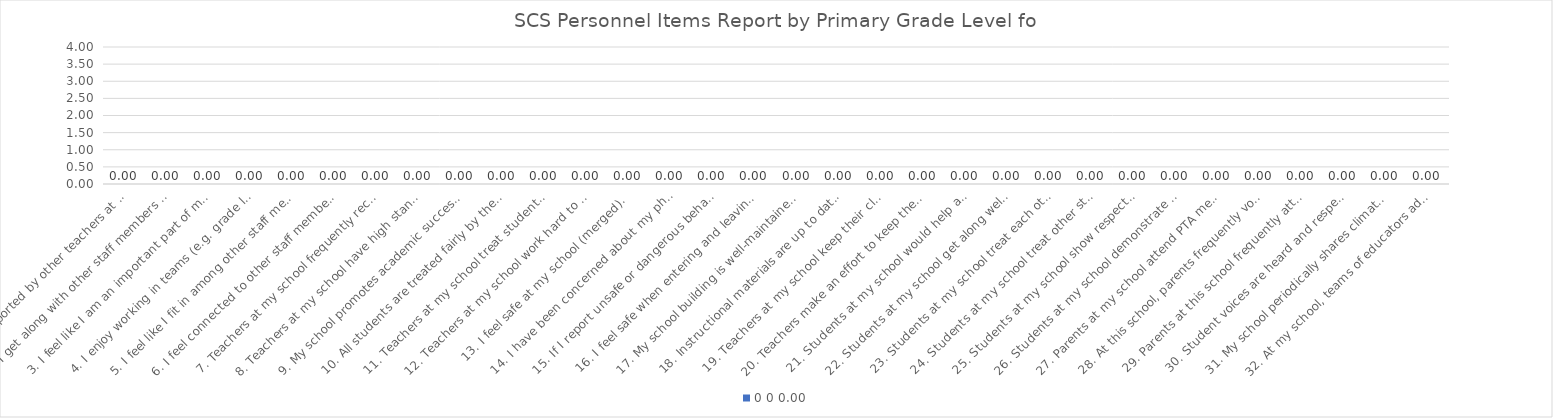
| Category | 0 |
|---|---|
| 1. I feel supported by other teachers at my school (merged) | 0 |
| 2. I get along with other staff members at my school (merged). | 0 |
| 3. I feel like I am an important part of my school (merged). | 0 |
| 4. I enjoy working in teams (e.g. grade level, content) at my school (merged). | 0 |
| 5. I feel like I fit in among other staff members at my school (merged). | 0 |
| 6. I feel connected to other staff members at my school (merged). | 0 |
| 7. Teachers at my school frequently recognize students for good behavior (merged). | 0 |
| 8. Teachers at my school have high standards for achievement (merged). | 0 |
| 9. My school promotes academic success for all students (merged). | 0 |
| 10. All students are treated fairly by the adults at my school (merged). | 0 |
| 11. Teachers at my school treat students fairly regardless of race, ethnicity, or culture (merged). | 0 |
| 12. Teachers at my school work hard to make sure that students do well (merged). | 0 |
| 13. I feel safe at my school (merged). | 0 |
| 14. I have been concerned about my physical safety at school (merged). | 0 |
| 15. If I report unsafe or dangerous behaviors, I can be sure the problem will be taken care of (merged). | 0 |
| 16. I feel safe when entering and leaving my school building (merged). | 0 |
| 17. My school building is well-maintained (merged). | 0 |
| 18. Instructional materials are up to date and in good condition (merged). | 0 |
| 19. Teachers at my school keep their classrooms clean and organized (merged). | 0 |
| 20. Teachers make an effort to keep the school building and facilities clean (merged). | 0 |
| 21. Students at my school would help another student who was being bullied (merged). | 0 |
| 22. Students at my school get along well with one another (merged). | 0 |
| 23. Students at my school treat each other with respect (merged). | 0 |
| 24. Students at my school treat other students fairly regardless of race, ethnicity, or culture (merged). | 0 |
| 25. Students at my school show respect to other students regardless of their academic ability (merged). | 0 |
| 26. Students at my school demonstrate behaviors that allow teachers to teach, and students to learn (merged). | 0 |
| 27. Parents at my school attend PTA meetings or parent/teacher conferences (merged). | 0 |
| 28. At this school, parents frequently volunteer to help on special projects (merged). | 0 |
| 29. Parents at this school frequently attend school activities (merged). | 0 |
| 30. Student voices are heard and respected at my school (merged). | 0 |
| 31. My school periodically shares climate and culture data with all stakeholders (merged). | 0 |
| 32. At my school, teams of educators address positive classroom learning environments (merged). | 0 |